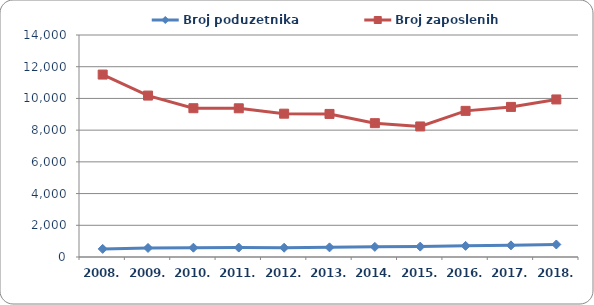
| Category | Broj poduzetnika  | Broj zaposlenih  |
|---|---|---|
| 2008. | 510 | 11505 |
| 2009. | 571 | 10180 |
| 2010. | 587 | 9383 |
| 2011. | 595 | 9378 |
| 2012. | 585 | 9038 |
| 2013. | 607 | 9022 |
| 2014. | 639 | 8440 |
| 2015. | 655 | 8232 |
| 2016. | 703 | 9216 |
| 2017. | 734 | 9465 |
| 2018. | 789 | 9936 |